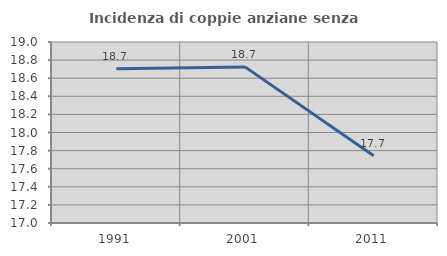
| Category | Incidenza di coppie anziane senza figli  |
|---|---|
| 1991.0 | 18.705 |
| 2001.0 | 18.725 |
| 2011.0 | 17.742 |